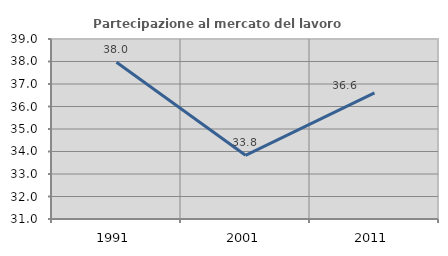
| Category | Partecipazione al mercato del lavoro  femminile |
|---|---|
| 1991.0 | 37.964 |
| 2001.0 | 33.831 |
| 2011.0 | 36.605 |